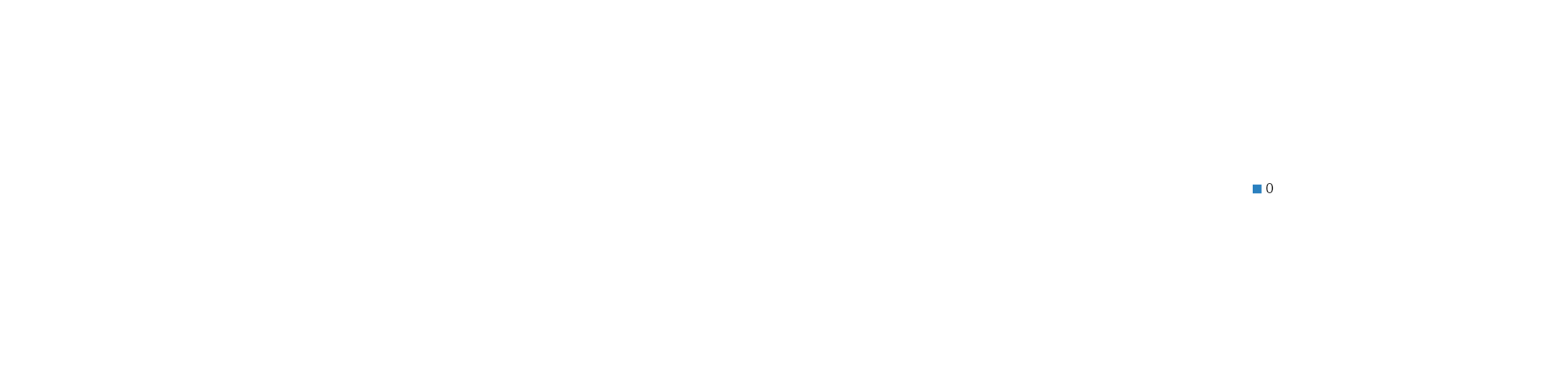
| Category | GHG Protocol Summary |
|---|---|
| 0.0 | 0 |